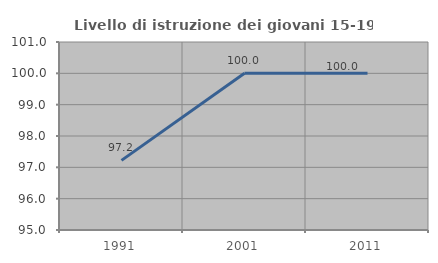
| Category | Livello di istruzione dei giovani 15-19 anni |
|---|---|
| 1991.0 | 97.222 |
| 2001.0 | 100 |
| 2011.0 | 100 |